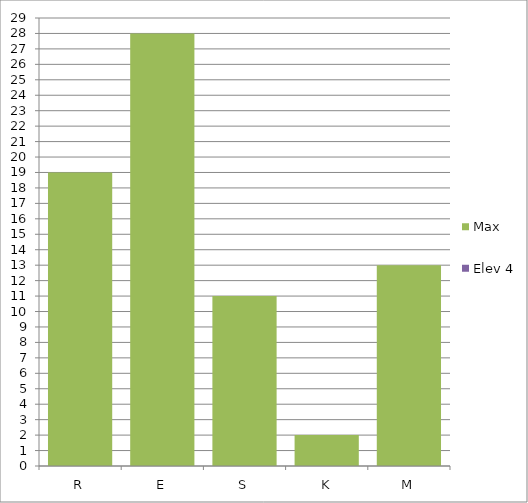
| Category | Max | Elev 4 |
|---|---|---|
| R | 19 | 0 |
| E | 28 | 0 |
| S | 11 | 0 |
| K | 2 | 0 |
| M | 13 | 0 |